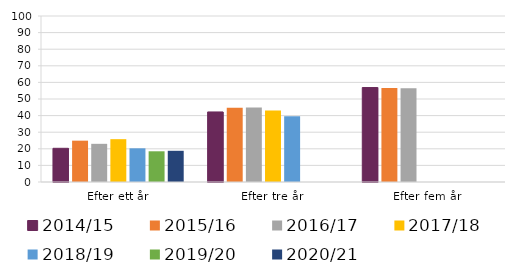
| Category | 2014/15 | 2015/16 | 2016/17 | 2017/18 | 2018/19 | 2019/20 | 2020/21 |
|---|---|---|---|---|---|---|---|
| Efter ett år | 20.3 | 24.9 | 23 | 25.8 | 20.3 | 18.5 | 18.8 |
| Efter tre år | 42.2 | 44.8 | 44.9 | 43 | 39.6 | 0 | 0 |
| Efter fem år | 56.9 | 56.6 | 56.5 | 0 | 0 | 0 | 0 |